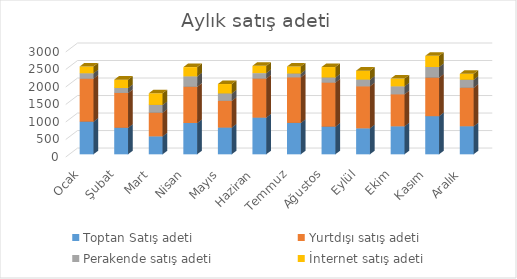
| Category | Toptan Satış adeti | Yurtdışı satış adeti | Perakende satış adeti | İnternet satış adeti |
|---|---|---|---|---|
| Ocak | 933 | 1229 | 152 | 194 |
| Şubat | 758 | 994 | 141 | 238 |
| Mart | 513 | 676 | 221 | 333 |
| Nisan | 894 | 1036 | 296 | 264 |
| Mayıs | 764 | 764 | 209 | 270 |
| Haziran | 1048 | 1117 | 154 | 208 |
| Temmuz | 897 | 1304 | 105 | 202 |
| Ağustos | 790 | 1260 | 143 | 299 |
| Eylül | 742 | 1202 | 189 | 256 |
| Ekim | 800 | 916 | 225 | 222 |
| Kasım | 1090 | 1100 | 304 | 318 |
| Aralık | 802 | 1100 | 227 | 171 |